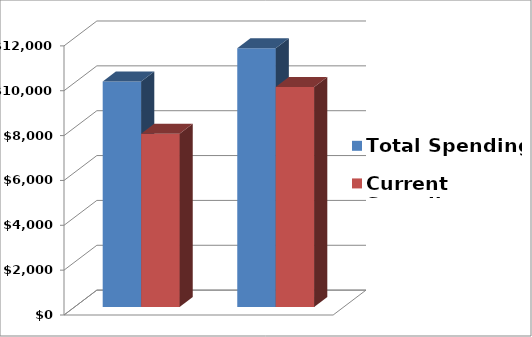
| Category | Total Spending | Current Spending |
|---|---|---|
| 0 | 10053.337 | 7729.277 |
| 1 | 11535.116 | 9807.561 |